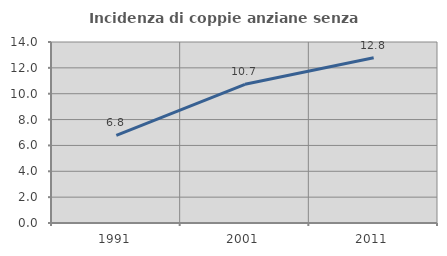
| Category | Incidenza di coppie anziane senza figli  |
|---|---|
| 1991.0 | 6.783 |
| 2001.0 | 10.73 |
| 2011.0 | 12.776 |